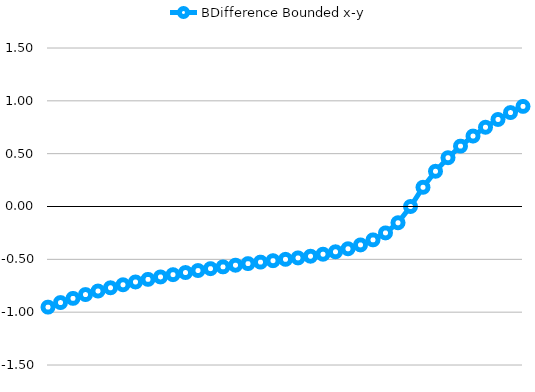
| Category | BDifference Bounded x-y |
|---|---|
|  | -0.952 |
|  | -0.909 |
|  | -0.87 |
|  | -0.833 |
|  | -0.8 |
|  | -0.769 |
|  | -0.741 |
|  | -0.714 |
|  | -0.69 |
|  | -0.667 |
|  | -0.645 |
|  | -0.625 |
|  | -0.606 |
|  | -0.588 |
|  | -0.571 |
|  | -0.556 |
|  | -0.541 |
|  | -0.526 |
|  | -0.513 |
|  | -0.5 |
|  | -0.486 |
|  | -0.471 |
|  | -0.452 |
|  | -0.429 |
|  | -0.4 |
|  | -0.364 |
|  | -0.316 |
|  | -0.25 |
|  | -0.154 |
|  | 0 |
|  | 0.182 |
|  | 0.333 |
|  | 0.462 |
|  | 0.571 |
|  | 0.667 |
|  | 0.75 |
|  | 0.824 |
|  | 0.889 |
|  | 0.947 |